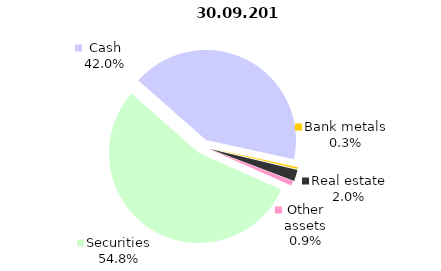
| Category | Total |
|---|---|
| Securities | 849.749 |
| Cash | 650.537 |
| Bank metals | 5.006 |
| Real estate | 31.489 |
| Other assets | 13.492 |